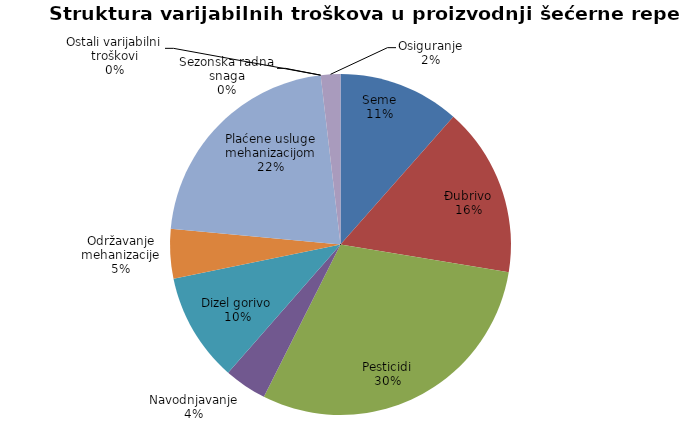
| Category | Series 0 |
|---|---|
| Seme | 18600 |
| Đubrivo | 26000 |
| Pesticidi | 48180 |
| Navodnjavanje | 6525 |
| Dizel gorivo | 16675 |
| Održavanje mehanizacije | 7609.167 |
| Plaćene usluge mehanizacijom | 35000 |
| Sezonska radna snaga | 0 |
| Ostali varijabilni troškovi | 0 |
| Osiguranje | 3000 |